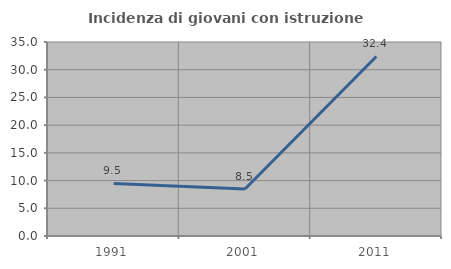
| Category | Incidenza di giovani con istruzione universitaria |
|---|---|
| 1991.0 | 9.483 |
| 2001.0 | 8.491 |
| 2011.0 | 32.394 |